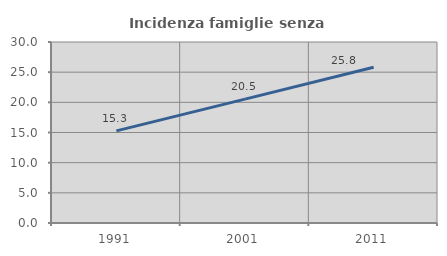
| Category | Incidenza famiglie senza nuclei |
|---|---|
| 1991.0 | 15.273 |
| 2001.0 | 20.532 |
| 2011.0 | 25.824 |